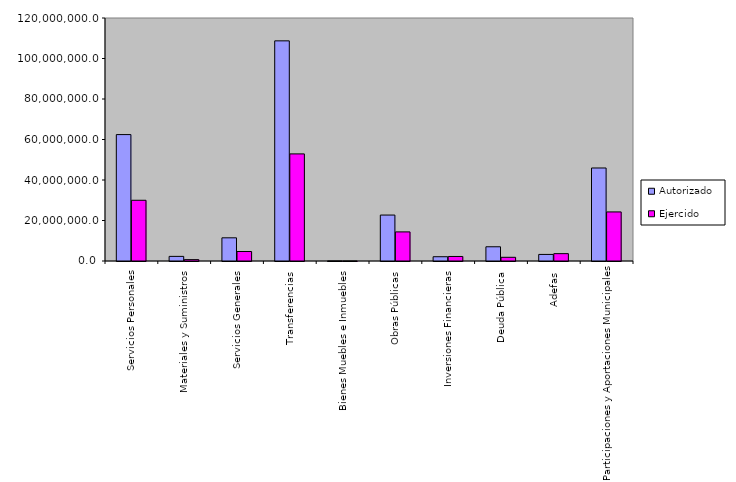
| Category | Autorizado | Ejercido |
|---|---|---|
| 0 | 62425093.1 | 29987072.7 |
| 1 | 2280669.4 | 672847.2 |
| 2 | 11446262.6 | 4685722.1 |
| 3 | 108714267.7 | 52890758.2 |
| 4 | 27837.8 | 1053.5 |
| 5 | 22690976.6 | 14369060.5 |
| 6 | 2112371.6 | 2236087.8 |
| 7 | 7028877.9 | 1822502.5 |
| 8 | 3243691 | 3631198.1 |
| 9 | 45928543.9 | 24229512.6 |